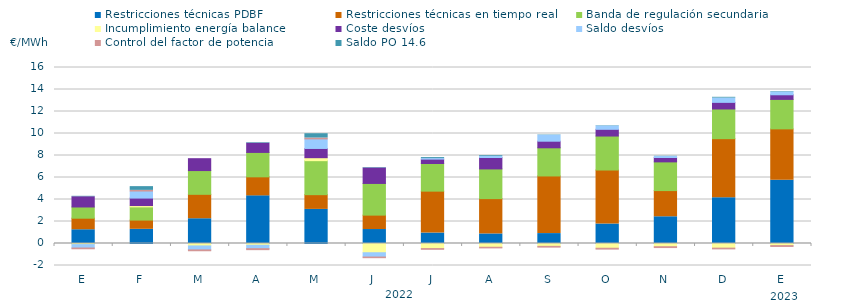
| Category | Restricciones técnicas PDBF | Restricciones técnicas en tiempo real | Banda de regulación secundaria | Incumplimiento energía balance | Coste desvíos | Saldo desvíos | Control del factor de potencia | Saldo PO 14.6 |
|---|---|---|---|---|---|---|---|---|
| E | 1.25 | 1.05 | 1.02 | -0.1 | 0.93 | -0.31 | -0.07 | 0.04 |
| F | 1.29 | 0.84 | 1.2 | 0.12 | 0.68 | 0.64 | 0.06 | 0.34 |
| M | 2.25 | 2.22 | 2.16 | -0.22 | 1.08 | -0.36 | -0.08 | 0 |
| A | 4.33 | 1.73 | 2.22 | -0.16 | 0.84 | -0.31 | -0.09 | 0.05 |
| M | 3.1 | 1.34 | 3.09 | 0.27 | 0.84 | 0.87 | 0.08 | 0.39 |
| J | 1.27 | 1.31 | 2.88 | -0.84 | 1.41 | -0.39 | -0.06 | 0.04 |
| J | 0.95 | 3.81 | 2.51 | -0.46 | 0.4 | 0.05 | -0.07 | 0.09 |
| A | 0.87 | 3.21 | 2.7 | -0.34 | 1.04 | 0.09 | -0.06 | 0.07 |
| S | 0.9 | 5.24 | 2.56 | -0.26 | 0.6 | 0.54 | -0.07 | 0.03 |
| O | 1.77 | 4.91 | 3.09 | -0.43 | 0.61 | 0.3 | -0.08 | 0.03 |
| N | 2.43 | 2.38 | 2.61 | -0.29 | 0.4 | 0.09 | -0.08 | 0.02 |
| D | 4.17 | 5.36 | 2.7 | -0.42 | 0.6 | 0.39 | -0.07 | 0.07 |
| E | 5.76 | 4.66 | 2.68 | -0.19 | 0.42 | 0.26 | -0.08 | 0.04 |